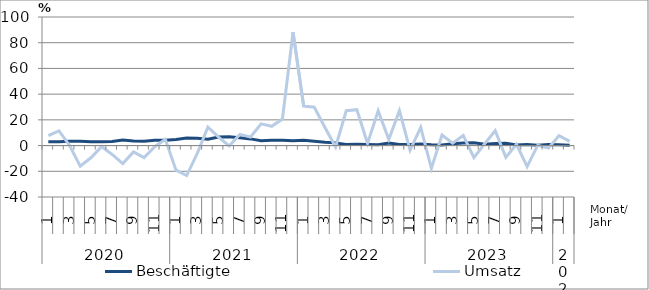
| Category | Beschäftigte | Umsatz |
|---|---|---|
| 0 | 2.9 | 7.8 |
| 1 | 2.9 | 11.5 |
| 2 | 3.4 | 0.1 |
| 3 | 3.4 | -16.1 |
| 4 | 2.9 | -9.5 |
| 5 | 2.9 | -0.8 |
| 6 | 3.1 | -6.9 |
| 7 | 4.3 | -14 |
| 8 | 3.6 | -4.9 |
| 9 | 3.4 | -9.4 |
| 10 | 4.1 | -0.9 |
| 11 | 4.1 | 4.9 |
| 12 | 4.8 | -19.1 |
| 13 | 5.8 | -23.3 |
| 14 | 5.6 | -6.1 |
| 15 | 5 | 14.4 |
| 16 | 6.6 | 6.6 |
| 17 | 6.9 | -0.3 |
| 18 | 6 | 8.7 |
| 19 | 5.2 | 6.7 |
| 20 | 3.8 | 16.9 |
| 21 | 4.2 | 15 |
| 22 | 4.2 | 20.6 |
| 23 | 3.7 | 88.1 |
| 24 | 4.1 | 30.7 |
| 25 | 3.4 | 29.8 |
| 26 | 2.6 | 14.1 |
| 27 | 2.1 | -1.1 |
| 28 | 0.9 | 27.1 |
| 29 | 1 | 27.9 |
| 30 | 0.8 | 1.7 |
| 31 | 0.7 | 27 |
| 32 | 2 | 4.7 |
| 33 | 0.9 | 27.1 |
| 34 | 0.9 | -3.5 |
| 35 | 1.2 | 14.1 |
| 36 | 0.6 | -17.8 |
| 37 | 0.5 | 8.2 |
| 38 | 1.4 | 1.9 |
| 39 | 2 | 7.9 |
| 40 | 2.2 | -9.4 |
| 41 | 1 | 1.3 |
| 42 | 1.6 | 11.5 |
| 43 | 1.8 | -9.2 |
| 44 | 0.4 | 1 |
| 45 | 0.8 | -16.4 |
| 46 | 0.3 | 0.3 |
| 47 | 0.8 | -2 |
| 48 | 0.6 | 7.7 |
| 49 | 0.3 | 3.3 |